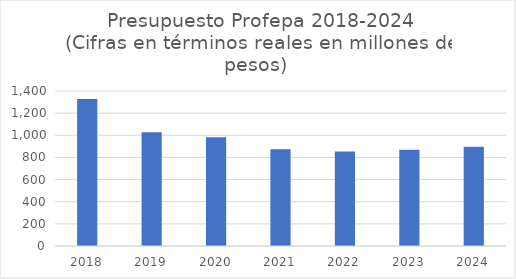
| Category | Series 0 |
|---|---|
| 2018.0 | 1328 |
| 2019.0 | 1027 |
| 2020.0 | 982 |
| 2021.0 | 873 |
| 2022.0 | 854 |
| 2023.0 | 870 |
| 2024.0 | 896 |